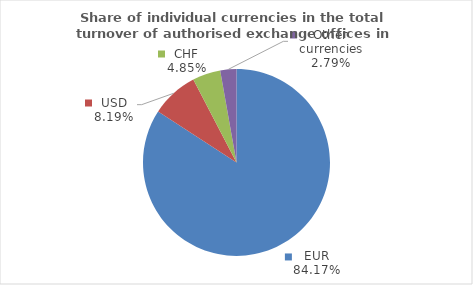
| Category | Series 0 |
|---|---|
| EUR | 84.171 |
| USD | 8.187 |
| CHF | 4.848 |
| Other currencies | 2.794 |